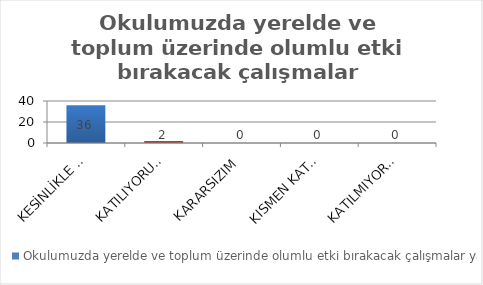
| Category | Okulumuzda yerelde ve toplum üzerinde olumlu etki bırakacak çalışmalar yapmaktadır. |
|---|---|
| KESİNLİKLE KATILIYORUM | 36 |
| KATILIYORUM | 2 |
| KARARSIZIM | 0 |
| KISMEN KATILIYORUM | 0 |
| KATILMIYORUM | 0 |